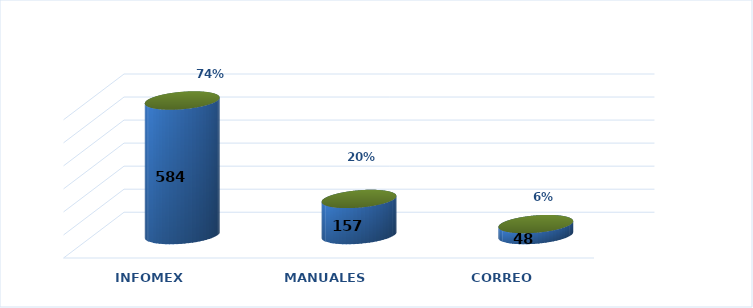
| Category | Series 0 | Series 1 |
|---|---|---|
| INFOMEX | 584 | 0.74 |
| MANUALES | 157 | 0.199 |
| CORREO | 48 | 0.061 |